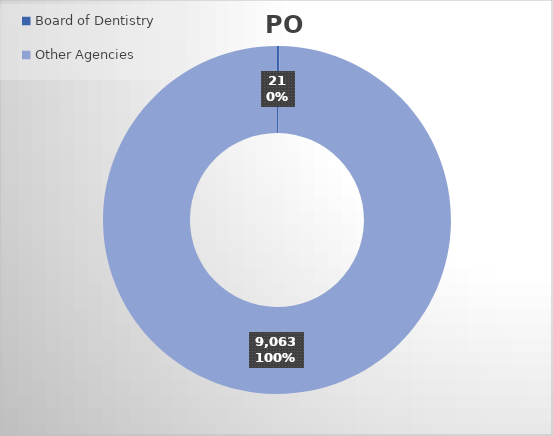
| Category | PO Lines |
|---|---|
| Board of Dentistry | 21 |
| Other Agencies | 9063 |